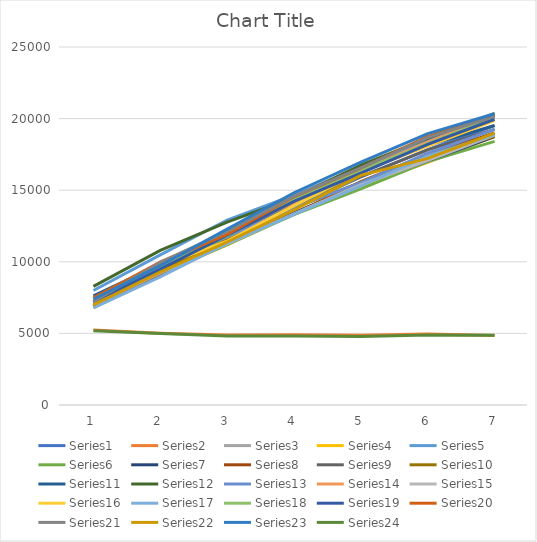
| Category | Series 0 | Series 1 | Series 2 | Series 3 | Series 4 | Series 5 | Series 6 | Series 7 | Series 8 | Series 9 | Series 10 | Series 11 | Series 12 | Series 13 | Series 14 | Series 15 | Series 16 | Series 17 | Series 18 | Series 19 | Series 20 | Series 21 | Series 22 | Series 23 |
|---|---|---|---|---|---|---|---|---|---|---|---|---|---|---|---|---|---|---|---|---|---|---|---|---|
| 0 | 7162 | 5238 | 7395 | 6779 | 7997 | 6963 | 6902 | 6866 | 7219 | 6862 | 7626 | 8287 | 7128 | 7422 | 6995 | 7368 | 6775 | 7176 | 7207 | 7486 | 7217 | 6996 | 7385 | 5187 |
| 1 | 9599 | 5018 | 9685 | 9169 | 10483 | 9175 | 9245 | 9130 | 9446 | 9412 | 9820 | 10801 | 9670 | 9992 | 9220 | 9714 | 8944 | 9598 | 9493 | 9961 | 9970 | 9287 | 9733 | 5000 |
| 2 | 11644 | 4884 | 12049 | 11183 | 12916 | 11202 | 11429 | 11494 | 11834 | 11598 | 11889 | 12766 | 11744 | 11929 | 11244 | 11445 | 11298 | 11806 | 11855 | 11911 | 12122 | 11382 | 12278 | 4815 |
| 3 | 13765 | 4903 | 14422 | 13375 | 14660 | 13289 | 13422 | 13325 | 14132 | 13763 | 14072 | 14478 | 13788 | 14125 | 13343 | 13921 | 13316 | 14391 | 14222 | 14541 | 14566 | 13624 | 14823 | 4810 |
| 4 | 15923 | 4877 | 16389 | 15301 | 16619 | 15096 | 15444 | 15603 | 15944 | 15550 | 16492 | 16743 | 15534 | 16383 | 15383 | 16302 | 15309 | 16403 | 16186 | 16549 | 16567 | 16037 | 16961 | 4783 |
| 5 | 17830 | 4961 | 18430 | 16948 | 18564 | 16993 | 17049 | 17492 | 17818 | 17456 | 18129 | 18616 | 17581 | 18359 | 17074 | 18078 | 17372 | 18237 | 18197 | 18752 | 18667 | 17224 | 18948 | 4884 |
| 6 | 19515 | 4847 | 20148 | 18742 | 20178 | 18408 | 18737 | 19003 | 19248 | 18757 | 19518 | 20357 | 19245 | 20155 | 18846 | 19859 | 18888 | 20127 | 19953 | 20208 | 20160 | 18990 | 20342 | 4877 |